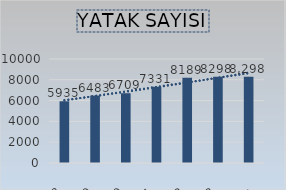
| Category | Series 6 |
|---|---|
| 2018 | 5935 |
| 2019 | 6483 |
| 2020 | 6709 |
| 2021 | 7331 |
| 2022 | 8189 |
| 2023 | 8298 |
| 2024(Ocak Ayı İtibariyle) | 8298 |